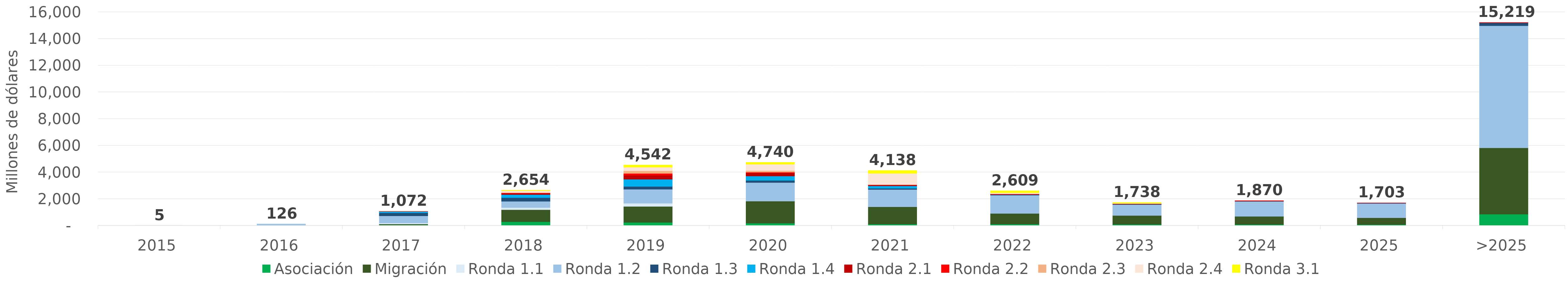
| Category | Asociación | Migración | Ronda 1.1 | Ronda 1.2 | Ronda 1.3 | Ronda 1.4 | Ronda 2.1 | Ronda 2.2 | Ronda 2.3 | Ronda 2.4 | Ronda 3.1 |
|---|---|---|---|---|---|---|---|---|---|---|---|
| 2015 | 0 | 0 | 4.573 | 0.236 | 0 | 0 | 0 | 0 | 0 | 0 | 0 |
| 2016 | 0 | 0 | 16.79 | 108.909 | 0 | 0 | 0 | 0 | 0 | 0 | 0 |
| 2017 | 50.877 | 65.422 | 76.429 | 533.486 | 231.789 | 93.443 | 18.851 | 1.29 | 0.72 | 0 | 0 |
| 2018 | 289.394 | 902.921 | 155.042 | 470.128 | 278.302 | 226.903 | 104.896 | 21.902 | 26.974 | 139.641 | 37.691 |
| 2019 | 241.207 | 1195.818 | 236.68 | 1049.68 | 207.126 | 540.649 | 302.09 | 133.009 | 199.161 | 270.262 | 166.186 |
| 2020 | 177.3 | 1658.785 | 6.736 | 1382.287 | 160.039 | 328.47 | 241.195 | 43.594 | 120.24 | 477.051 | 144.633 |
| 2021 | 111.804 | 1294.964 | 2.229 | 1293.069 | 88.66 | 182.896 | 69.096 | 23.383 | 0.955 | 847.746 | 222.82 |
| 2022 | 112.591 | 798.545 | 0 | 1363.556 | 40.604 | 7.84 | 24.433 | 30.033 | 0 | 82.428 | 149.451 |
| 2023 | 87.085 | 669.696 | 0 | 815.124 | 34.741 | 0 | 0 | 36.282 | 0 | 32.499 | 62.088 |
| 2024 | 79.455 | 613.256 | 0 | 1120.717 | 30.041 | 0 | 0 | 26.685 | 0 | 0 | 0 |
| 2025 | 75.288 | 512.631 | 0 | 1074.435 | 30.797 | 0 | 0 | 9.414 | 0 | 0 | 0 |
| >2025 | 859.226 | 4966.547 | 0 | 9146.402 | 225.326 | 0 | 0 | 21.146 | 0 | 0 | 0 |